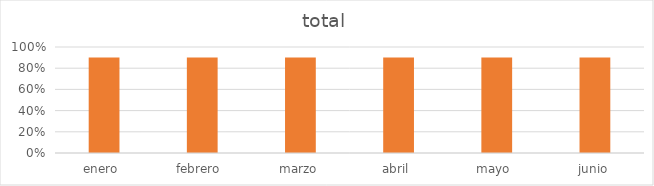
| Category | total |
|---|---|
| enero  | 0.9 |
| febrero  | 0.9 |
| marzo | 0.9 |
| abril  | 0.9 |
| mayo  | 0.9 |
| junio | 0.9 |